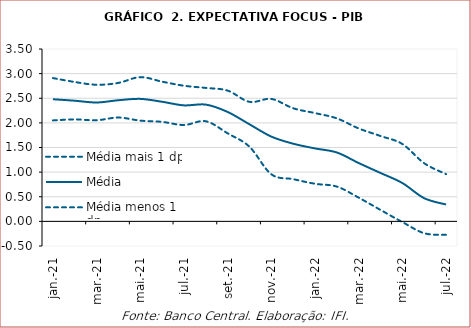
| Category | Média mais 1 dp | Média | Média menos 1 dp |
|---|---|---|---|
| 2021-01-01 | 2.91 | 2.48 | 2.05 |
| 2021-02-01 | 2.83 | 2.45 | 2.07 |
| 2021-03-01 | 2.774 | 2.414 | 2.054 |
| 2021-04-01 | 2.812 | 2.46 | 2.108 |
| 2021-05-01 | 2.929 | 2.487 | 2.046 |
| 2021-06-01 | 2.837 | 2.429 | 2.021 |
| 2021-07-01 | 2.754 | 2.356 | 1.957 |
| 2021-08-01 | 2.71 | 2.371 | 2.032 |
| 2021-09-01 | 2.655 | 2.221 | 1.788 |
| 2021-10-01 | 2.427 | 1.971 | 1.515 |
| 2021-11-01 | 2.486 | 1.721 | 0.956 |
| 2021-12-01 | 2.297 | 1.577 | 0.857 |
| 2022-01-01 | 2.199 | 1.481 | 0.764 |
| 2022-02-01 | 2.091 | 1.399 | 0.706 |
| 2022-03-01 | 1.887 | 1.184 | 0.481 |
| 2022-04-01 | 1.733 | 0.982 | 0.231 |
| 2022-05-01 | 1.571 | 0.778 | -0.014 |
| 2022-06-01 | 1.18 | 0.47 | -0.24 |
| 2022-07-01 | 0.959 | 0.342 | -0.274 |